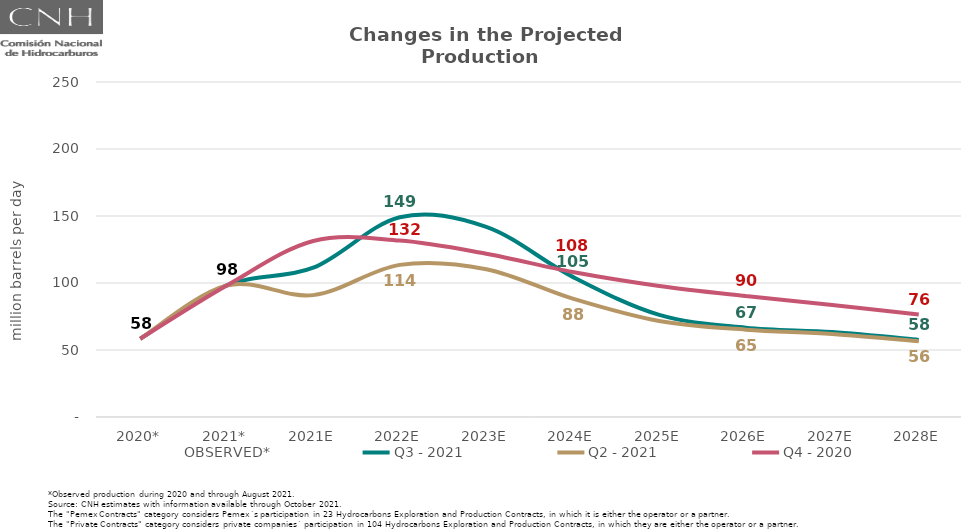
| Category | OBSERVED* | Q3 - 2021 | Q2 - 2021 | Q4 - 2020 |
|---|---|---|---|---|
| 2020* | 58.422 | 58.422 | 58.422 | 58.422 |
| 2021* | 98.178 | 98.178 | 98.178 | 98.178 |
| 2021E | 111.398 | 111.398 | 90.959 | 131.36 |
| 2022E | 149.117 | 149.117 | 113.542 | 131.65 |
| 2023E | 141.852 | 141.852 | 110.319 | 121.8 |
| 2024E | 104.59 | 104.59 | 88.312 | 108.242 |
| 2025E | 76.217 | 76.217 | 71.63 | 97.834 |
| 2026E | 66.704 | 66.704 | 65.162 | 90.286 |
| 2027E | 63.356 | 63.356 | 61.983 | 83.585 |
| 2028E | 57.555 | 57.555 | 56.483 | 76.444 |